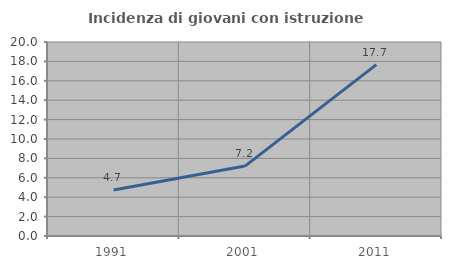
| Category | Incidenza di giovani con istruzione universitaria |
|---|---|
| 1991.0 | 4.738 |
| 2001.0 | 7.207 |
| 2011.0 | 17.67 |